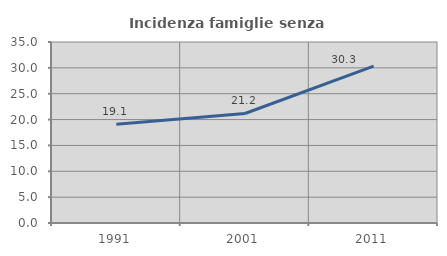
| Category | Incidenza famiglie senza nuclei |
|---|---|
| 1991.0 | 19.116 |
| 2001.0 | 21.178 |
| 2011.0 | 30.339 |